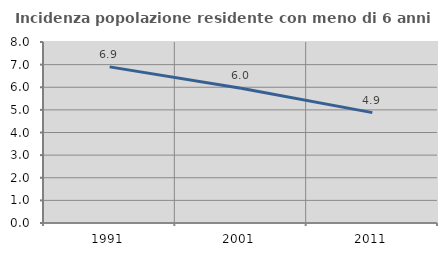
| Category | Incidenza popolazione residente con meno di 6 anni |
|---|---|
| 1991.0 | 6.901 |
| 2001.0 | 5.953 |
| 2011.0 | 4.878 |